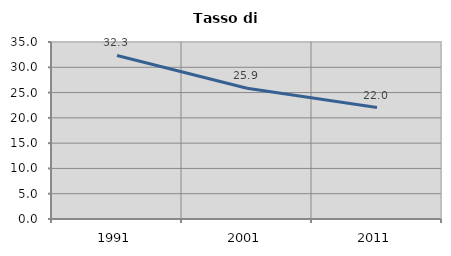
| Category | Tasso di disoccupazione   |
|---|---|
| 1991.0 | 32.344 |
| 2001.0 | 25.857 |
| 2011.0 | 22.029 |